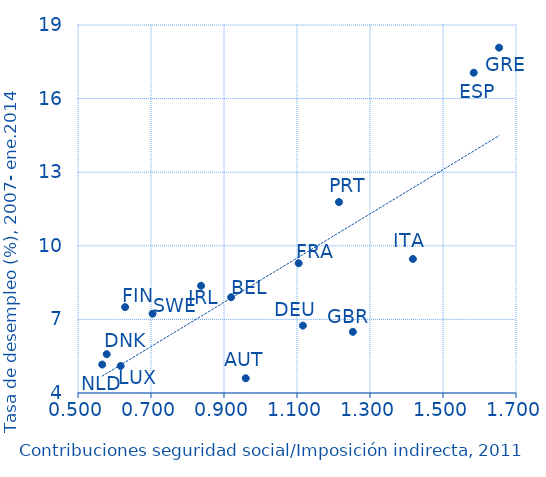
| Category | U_CSS/IT |
|---|---|
| 0.91955197974215 | 7.903 |
| 0.578576207973273 | 5.582 |
| 1.116199817981393 | 6.747 |
| 0.837193952896519 | 8.371 |
| 1.653555551865344 | 18.077 |
| 1.584159355519341 | 17.056 |
| 1.10448045281851 | 9.29 |
| 1.417465534924518 | 9.464 |
| 0.616805978274616 | 5.101 |
| 0.566311426759093 | 5.16 |
| 0.959525457933592 | 4.599 |
| 1.215031594169676 | 11.782 |
| 0.629139163289688 | 7.5 |
| 0.704235426042578 | 7.233 |
| 1.252997245893538 | 6.492 |